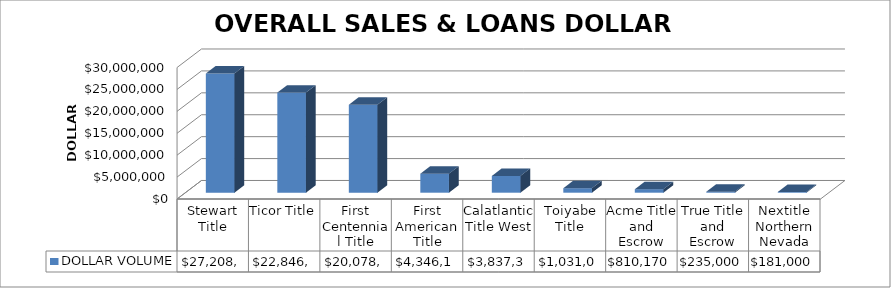
| Category | DOLLAR VOLUME |
|---|---|
| Stewart Title | 27208802.87 |
| Ticor Title | 22846127 |
| First Centennial Title | 20078750.66 |
| First American Title | 4346119.73 |
| Calatlantic Title West | 3837359 |
| Toiyabe Title | 1031000 |
| Acme Title and Escrow | 810170 |
| True Title and Escrow | 235000 |
| Nextitle Northern Nevada | 181000 |